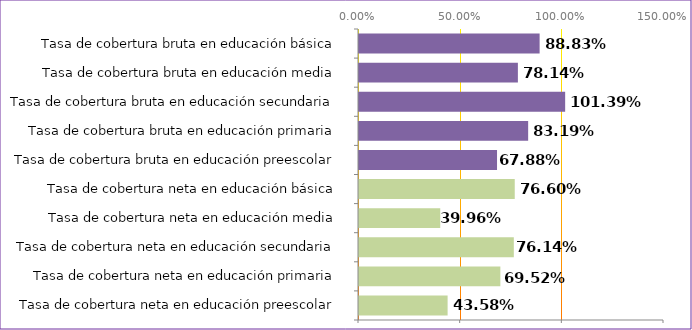
| Category | Series 0 |
|---|---|
| Tasa de cobertura neta en educación preescolar | 0.436 |
| Tasa de cobertura neta en educación primaria | 0.695 |
| Tasa de cobertura neta en educación secundaria | 0.761 |
| Tasa de cobertura neta en educación media | 0.4 |
| Tasa de cobertura neta en educación básica | 0.766 |
| Tasa de cobertura bruta en educación preescolar | 0.679 |
| Tasa de cobertura bruta en educación primaria | 0.832 |
| Tasa de cobertura bruta en educación secundaria | 1.014 |
| Tasa de cobertura bruta en educación media | 0.781 |
| Tasa de cobertura bruta en educación básica | 0.888 |